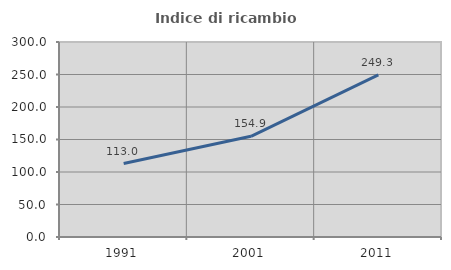
| Category | Indice di ricambio occupazionale  |
|---|---|
| 1991.0 | 113.043 |
| 2001.0 | 154.945 |
| 2011.0 | 249.315 |